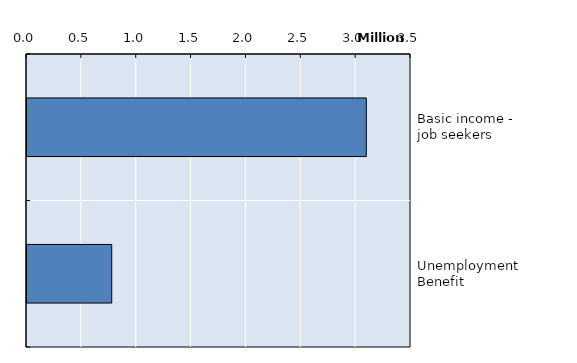
| Category | Series 0 |
|---|---|
| Basic income - job seekers | 3092540 |
| Unemployment Benefit | 772439 |